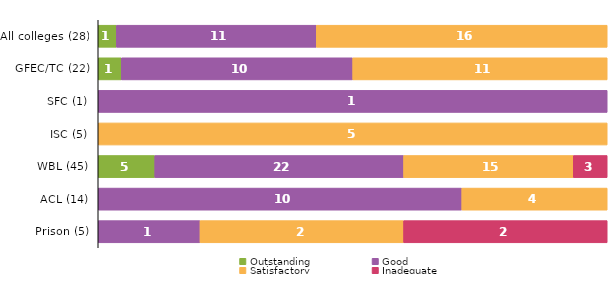
| Category | Outstanding | Good | Satisfactory | Inadequate |
|---|---|---|---|---|
| All colleges (28) | 1 | 11 | 16 | 0 |
| GFEC/TC (22) | 1 | 10 | 11 | 0 |
| SFC (1) | 0 | 1 | 0 | 0 |
| ISC (5) | 0 | 0 | 5 | 0 |
| WBL (45) | 5 | 22 | 15 | 3 |
| ACL (14) | 0 | 10 | 4 | 0 |
| Prison (5) | 0 | 1 | 2 | 2 |